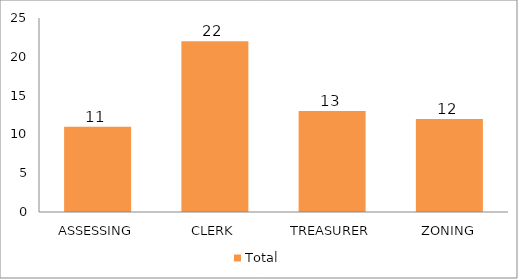
| Category | Total |
|---|---|
| ASSESSING | 11 |
| CLERK | 22 |
| TREASURER | 13 |
| ZONING | 12 |